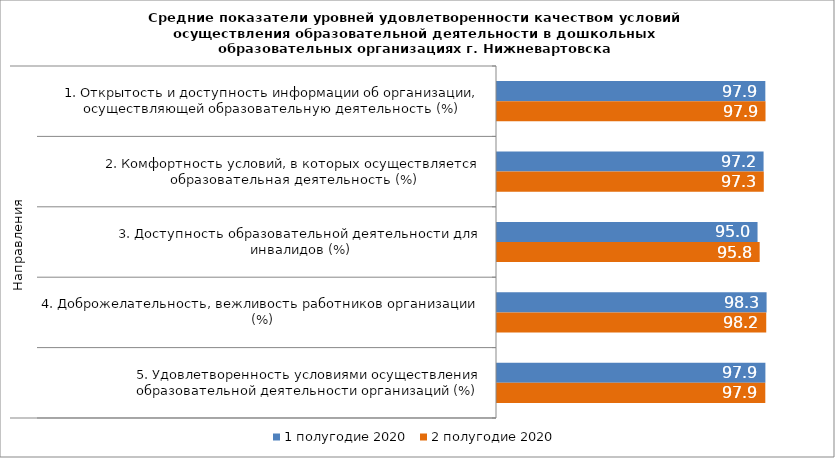
| Category | 1 полугодие 2020 | 2 полугодие 2020 |
|---|---|---|
| 0 | 97.87 | 97.937 |
| 1 | 97.23 | 97.306 |
| 2 | 95.031 | 95.806 |
| 3 | 98.332 | 98.201 |
| 4 | 97.896 | 97.86 |